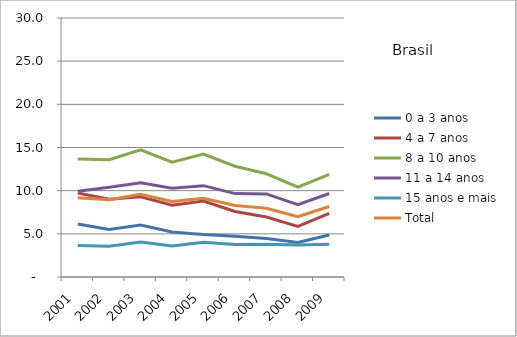
| Category | 0 a 3 anos | 4 a 7 anos | 8 a 10 anos | 11 a 14 anos | 15 anos e mais | Total |
|---|---|---|---|---|---|---|
| 2001.0 | 6.13 | 9.72 | 13.68 | 9.94 | 3.66 | 9.19 |
| 2002.0 | 5.5 | 9.02 | 13.59 | 10.4 | 3.57 | 8.96 |
| 2003.0 | 6.01 | 9.3 | 14.73 | 10.92 | 4.04 | 9.59 |
| 2004.0 | 5.21 | 8.31 | 13.3 | 10.29 | 3.58 | 8.75 |
| 2005.0 | 4.91 | 8.8 | 14.24 | 10.58 | 4.03 | 9.13 |
| 2006.0 | 4.73 | 7.59 | 12.83 | 9.66 | 3.76 | 8.29 |
| 2007.0 | 4.46 | 6.95 | 11.96 | 9.62 | 3.78 | 7.97 |
| 2008.0 | 4 | 5.86 | 10.42 | 8.39 | 3.71 | 6.99 |
| 2009.0 | 4.87 | 7.36 | 11.89 | 9.67 | 3.78 | 8.16 |